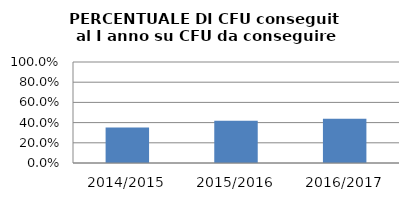
| Category | 2014/2015 2015/2016 2016/2017 |
|---|---|
| 2014/2015 | 0.351 |
| 2015/2016 | 0.418 |
| 2016/2017 | 0.437 |